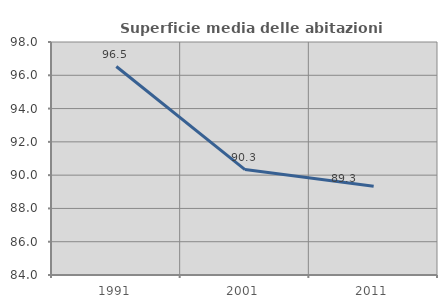
| Category | Superficie media delle abitazioni occupate |
|---|---|
| 1991.0 | 96.525 |
| 2001.0 | 90.332 |
| 2011.0 | 89.336 |